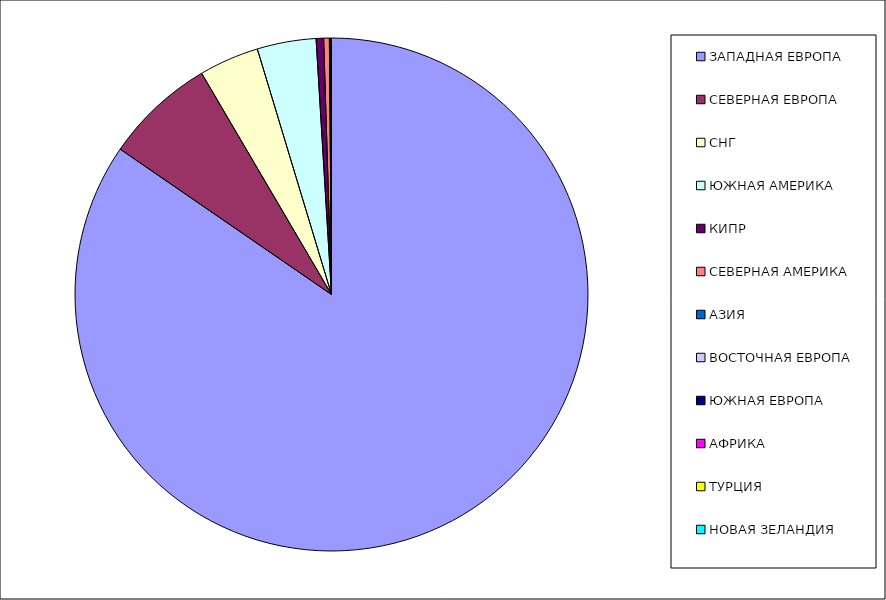
| Category | Оборот |
|---|---|
| ЗАПАДНАЯ ЕВРОПА | 0.846 |
| СЕВЕРНАЯ ЕВРОПА | 0.07 |
| СНГ | 0.038 |
| ЮЖНАЯ АМЕРИКА | 0.037 |
| КИПР | 0.005 |
| СЕВЕРНАЯ АМЕРИКА | 0.004 |
| АЗИЯ | 0.001 |
| ВОСТОЧНАЯ ЕВРОПА | 0 |
| ЮЖНАЯ ЕВРОПА | 0 |
| АФРИКА | 0 |
| ТУРЦИЯ | 0 |
| НОВАЯ ЗЕЛАНДИЯ | 0 |